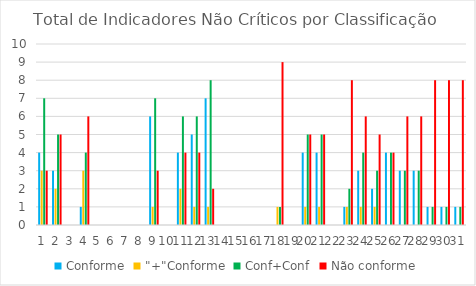
| Category | Conforme | "+"Conforme | Conf+Conf | Não conforme |
|---|---|---|---|---|
| 0 | 4 | 3 | 7 | 3 |
| 1 | 3 | 2 | 5 | 5 |
| 2 | 0 | 0 | 0 | 0 |
| 3 | 1 | 3 | 4 | 6 |
| 4 | 0 | 0 | 0 | 0 |
| 5 | 0 | 0 | 0 | 0 |
| 6 | 0 | 0 | 0 | 0 |
| 7 | 0 | 0 | 0 | 0 |
| 8 | 6 | 1 | 7 | 3 |
| 9 | 0 | 0 | 0 | 0 |
| 10 | 4 | 2 | 6 | 4 |
| 11 | 5 | 1 | 6 | 4 |
| 12 | 7 | 1 | 8 | 2 |
| 13 | 0 | 0 | 0 | 0 |
| 14 | 0 | 0 | 0 | 0 |
| 15 | 0 | 0 | 0 | 0 |
| 16 | 0 | 0 | 0 | 0 |
| 17 | 0 | 1 | 1 | 9 |
| 18 | 0 | 0 | 0 | 0 |
| 19 | 4 | 1 | 5 | 5 |
| 20 | 4 | 1 | 5 | 5 |
| 21 | 0 | 0 | 0 | 0 |
| 22 | 1 | 1 | 2 | 8 |
| 23 | 3 | 1 | 4 | 6 |
| 24 | 2 | 1 | 3 | 5 |
| 25 | 4 | 0 | 4 | 4 |
| 26 | 3 | 0 | 3 | 6 |
| 27 | 3 | 0 | 3 | 6 |
| 28 | 1 | 0 | 1 | 8 |
| 29 | 1 | 0 | 1 | 8 |
| 30 | 1 | 0 | 1 | 8 |